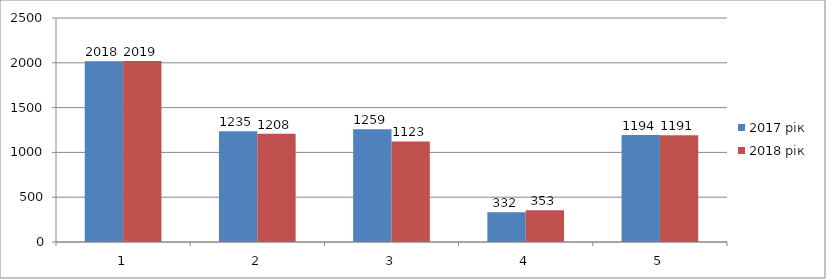
| Category | 2017 рік | 2018 рік |
|---|---|---|
| 0 | 2018 | 2019 |
| 1 | 1235 | 1208 |
| 2 | 1259 | 1123 |
| 3 | 332 | 353 |
| 4 | 1194 | 1191 |